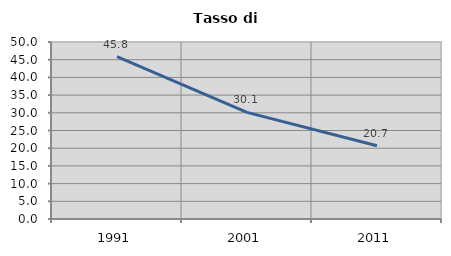
| Category | Tasso di disoccupazione   |
|---|---|
| 1991.0 | 45.849 |
| 2001.0 | 30.109 |
| 2011.0 | 20.699 |